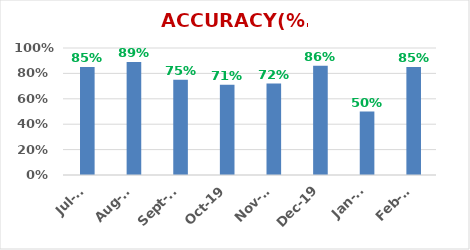
| Category | ACCURACY |
|---|---|
| 2020-02-01 | 0.85 |
| 2020-01-01 | 0.5 |
| 2019-12-01 | 0.86 |
| 2019-11-01 | 0.72 |
| 2019-10-01 | 0.71 |
| 2019-09-01 | 0.75 |
| 2019-08-01 | 0.89 |
| 2019-07-01 | 0.85 |